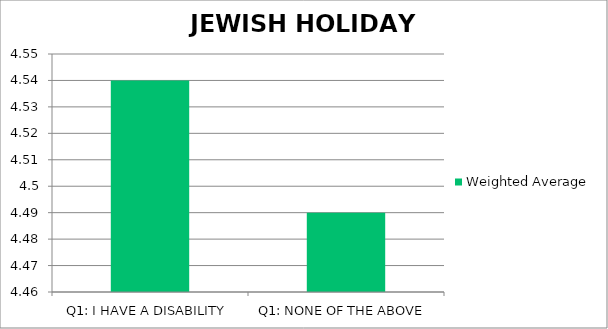
| Category | Weighted Average |
|---|---|
| Q1: I HAVE A DISABILITY | 4.54 |
| Q1: NONE OF THE ABOVE | 4.49 |